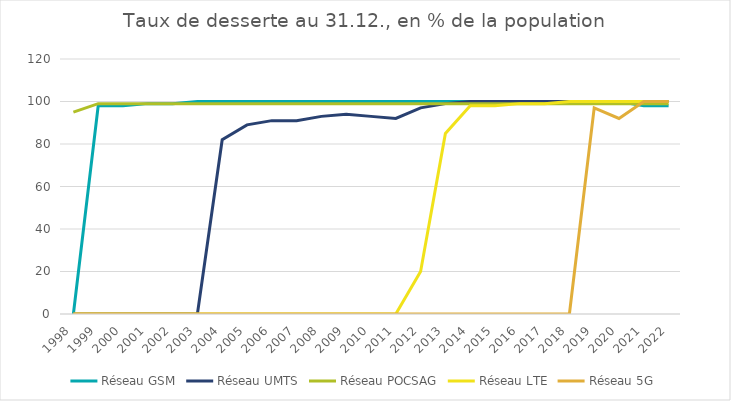
| Category | Réseau GSM | Réseau UMTS | Réseau POCSAG | Réseau LTE | Réseau 5G |
|---|---|---|---|---|---|
| 1998.0 | 0 | 0 | 95 | 0 | 0 |
| 1999.0 | 98 | 0 | 99 | 0 | 0 |
| 2000.0 | 98 | 0 | 99 | 0 | 0 |
| 2001.0 | 99 | 0 | 99 | 0 | 0 |
| 2002.0 | 99 | 0 | 99 | 0 | 0 |
| 2003.0 | 100 | 0 | 99 | 0 | 0 |
| 2004.0 | 100 | 82 | 99 | 0 | 0 |
| 2005.0 | 100 | 89 | 99 | 0 | 0 |
| 2006.0 | 100 | 91 | 99 | 0 | 0 |
| 2007.0 | 100 | 91 | 99 | 0 | 0 |
| 2008.0 | 100 | 93 | 99 | 0 | 0 |
| 2009.0 | 100 | 94 | 99 | 0 | 0 |
| 2010.0 | 100 | 93 | 99 | 0 | 0 |
| 2011.0 | 100 | 92 | 99 | 0 | 0 |
| 2012.0 | 100 | 97 | 99 | 20 | 0 |
| 2013.0 | 100 | 99 | 99 | 85 | 0 |
| 2014.0 | 100 | 100 | 99 | 98 | 0 |
| 2015.0 | 100 | 100 | 99 | 98 | 0 |
| 2016.0 | 100 | 100 | 99 | 99 | 0 |
| 2017.0 | 100 | 100 | 99 | 99 | 0 |
| 2018.0 | 100 | 100 | 99 | 100 | 0 |
| 2019.0 | 100 | 100 | 99 | 100 | 97 |
| 2020.0 | 100 | 100 | 99 | 100 | 92 |
| 2021.0 | 98 | 100 | 99 | 100 | 100 |
| 2022.0 | 98 | 100 | 99 | 100 | 100 |